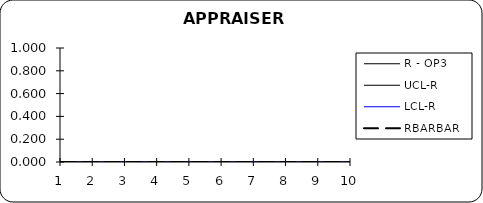
| Category | R - OP3 | UCL-R | LCL-R | RBARBAR |
|---|---|---|---|---|
| 0 | 0 | 0 | 0 | 0 |
| 1 | 0 | 0 | 0 | 0 |
| 2 | 0 | 0 | 0 | 0 |
| 3 | 0 | 0 | 0 | 0 |
| 4 | 0 | 0 | 0 | 0 |
| 5 | 0 | 0 | 0 | 0 |
| 6 | 0 | 0 | 0 | 0 |
| 7 | 0 | 0 | 0 | 0 |
| 8 | 0 | 0 | 0 | 0 |
| 9 | 0 | 0 | 0 | 0 |